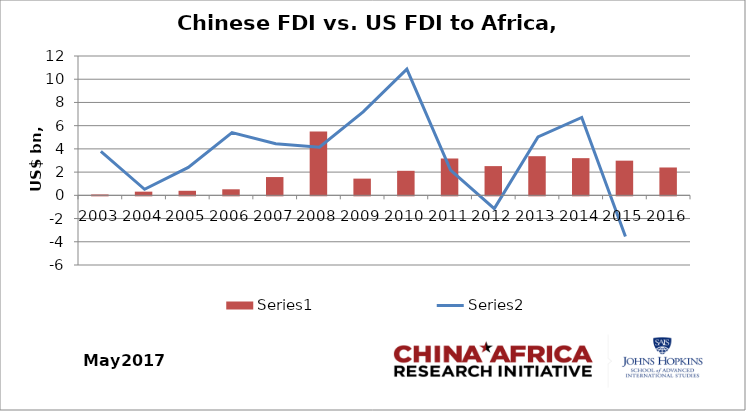
| Category | Series 0 |
|---|---|
| 2003.0 | 0.075 |
| 2004.0 | 0.317 |
| 2005.0 | 0.392 |
| 2006.0 | 0.52 |
| 2007.0 | 1.574 |
| 2008.0 | 5.491 |
| 2009.0 | 1.439 |
| 2010.0 | 2.112 |
| 2011.0 | 3.173 |
| 2012.0 | 2.517 |
| 2013.0 | 3.371 |
| 2014.0 | 3.202 |
| 2015.0 | 2.986 |
| 2016.0 | 2.399 |